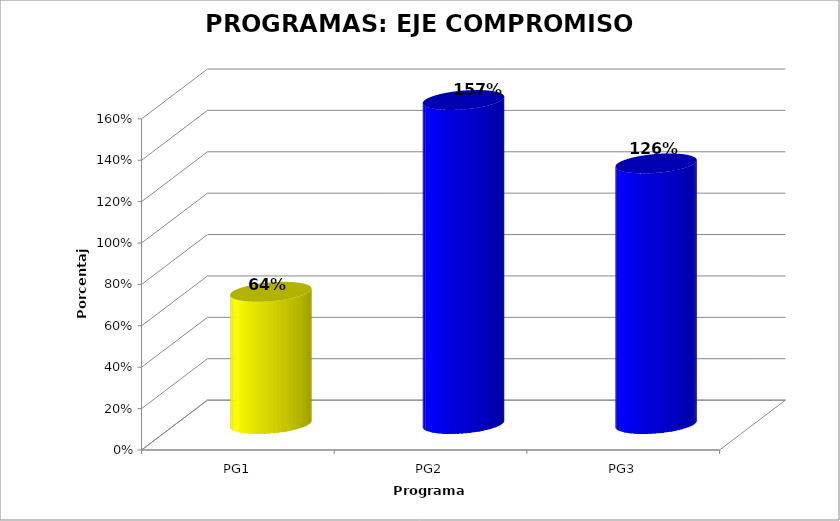
| Category | Series 0 |
|---|---|
| PG1 | 0.639 |
| PG2 | 1.566 |
| PG3 | 1.259 |